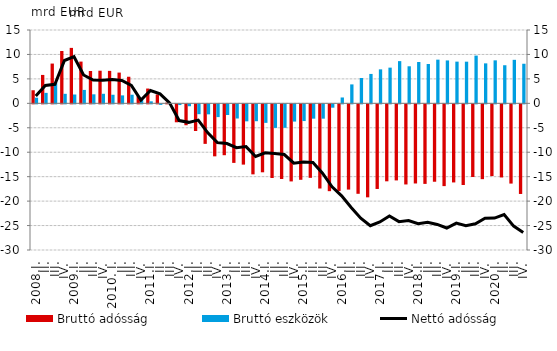
| Category | Bruttó adósság  | Bruttó eszközök |
|---|---|---|
| 2008.I. | 2.678 | 1.155 |
| II. | 5.81 | 2.14 |
| III. | 8.134 | 4.229 |
| IV. | 10.703 | 1.946 |
| 2009.I. | 11.342 | 1.807 |
| II. | 8.54 | 2.745 |
| III. | 6.618 | 1.846 |
| IV. | 6.671 | 1.952 |
| 2010. I. | 6.639 | 1.755 |
| II. | 6.289 | 1.626 |
| III. | 5.439 | 1.76 |
| IV. | 1.492 | 0.816 |
| 2011.I. | 3.024 | 0.408 |
| II. | 1.819 | -0.11 |
| III. | 0.155 | 0.068 |
| IV. | -3.672 | -0.147 |
| 2012.I. | -4.278 | -0.388 |
| II. | -5.449 | -2.015 |
| III. | -8.086 | -2.048 |
| IV. | -10.636 | -2.611 |
| 2013.I. | -10.407 | -2.179 |
| II. | -11.977 | -2.897 |
| III. | -12.329 | -3.478 |
| IV. | -14.322 | -3.451 |
| 2014.I. | -13.901 | -3.791 |
| II. | -15.074 | -4.821 |
| III. | -15.274 | -4.798 |
| IV. | -15.768 | -3.527 |
| 2015.I. | -15.435 | -3.419 |
| II. | -15.035 | -2.932 |
| III. | -17.217 | -2.932 |
| IV. | -17.762 | -0.688 |
| 2016.I. | -17.718 | 1.198 |
| II. | -17.437 | 3.873 |
| III. | -18.299 | 5.184 |
| IV. | -19.022 | 6.013 |
| 2017.I. | -17.312 | 6.95 |
| II. | -15.746 | 7.302 |
| III. | -15.563 | 8.633 |
| IV. | -16.389 | 7.58 |
| 2018.I. | -16.188 | 8.451 |
| II. | -16.273 | 8.045 |
| III. | -15.833 | 8.935 |
| IV. | -16.729 | 8.776 |
| 2019.I. | -15.976 | 8.531 |
| II. | -16.505 | 8.522 |
| III. | -14.862 | 9.762 |
| IV. | -15.307 | 8.175 |
| 2020.I. | -14.677 | 8.794 |
| II. | -14.956 | 7.793 |
| III. | -16.208 | 8.9 |
| IV. | -18.335 | 8.097 |